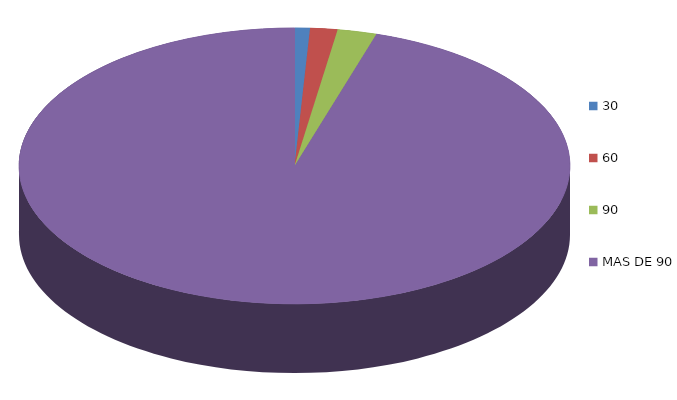
| Category | Series 0 | 336,576.2 598,357.6 860,139.1 35,602,278.4 |
|---|---|---|
| 30 | 336576.2 |  |
| 60 | 598357.6 |  |
| 90 | 860139.1 |  |
| MAS DE 90 | 35602278.4 |  |